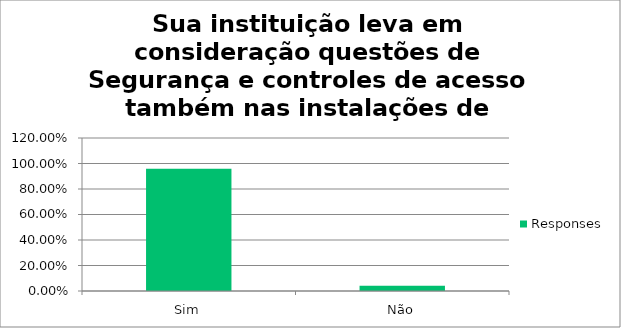
| Category | Responses |
|---|---|
| Sim | 0.958 |
| Não | 0.042 |